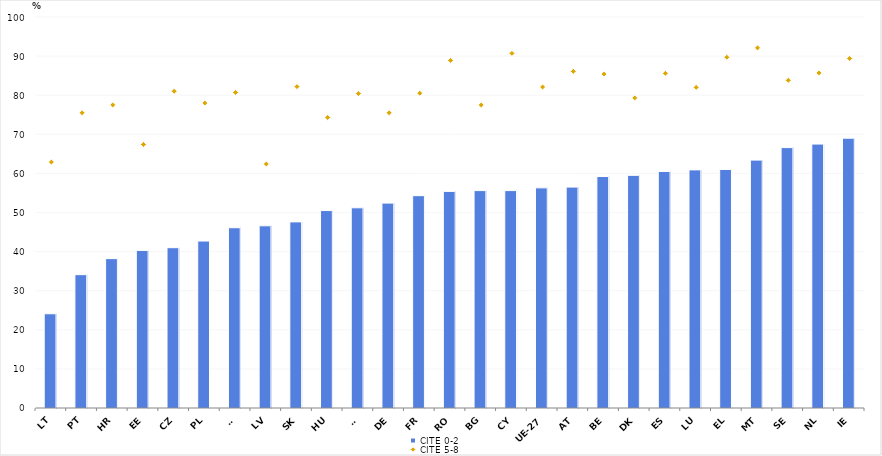
| Category | CITE 0-2 |
|---|---|
| LT | 24.1 |
| PT | 34.1 |
| HR | 38.2 |
| EE | 40.3 |
| CZ | 41 |
| PL | 42.7 |
| SI | 46.1 |
| LV | 46.6 |
| SK | 47.6 |
| HU | 50.5 |
| FI | 51.2 |
| DE | 52.4 |
| FR | 54.3 |
| RO | 55.4 |
| BG | 55.6 |
| CY | 55.6 |
| UE-27 | 56.3 |
| AT | 56.5 |
| BE | 59.2 |
| DK | 59.5 |
| ES | 60.5 |
| LU | 60.9 |
| EL | 61 |
| MT | 63.4 |
| SE | 66.6 |
| NL | 67.5 |
| IE | 69 |